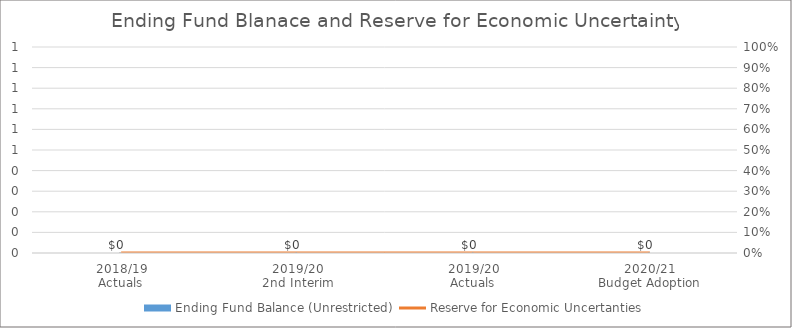
| Category | Ending Fund Balance (Unrestricted) |
|---|---|
| 2018/19
Actuals | 0 |
| 2019/20
2nd Interim | 0 |
| 2019/20
Actuals | 0 |
| 2020/21
Budget Adoption | 0 |